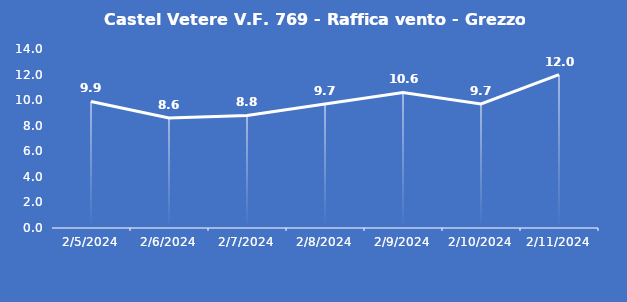
| Category | Castel Vetere V.F. 769 - Raffica vento - Grezzo (m/s) |
|---|---|
| 2/5/24 | 9.9 |
| 2/6/24 | 8.6 |
| 2/7/24 | 8.8 |
| 2/8/24 | 9.7 |
| 2/9/24 | 10.6 |
| 2/10/24 | 9.7 |
| 2/11/24 | 12 |